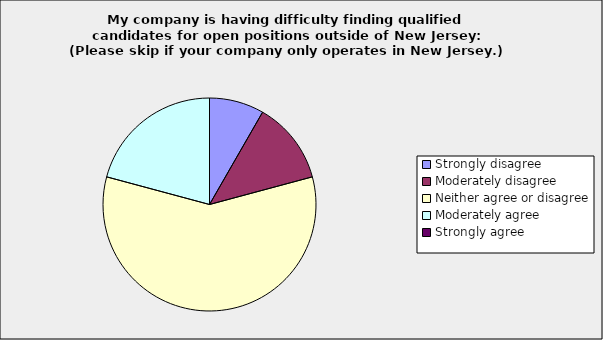
| Category | Series 0 |
|---|---|
| Strongly disagree | 0.083 |
| Moderately disagree | 0.125 |
| Neither agree or disagree | 0.583 |
| Moderately agree | 0.208 |
| Strongly agree | 0 |